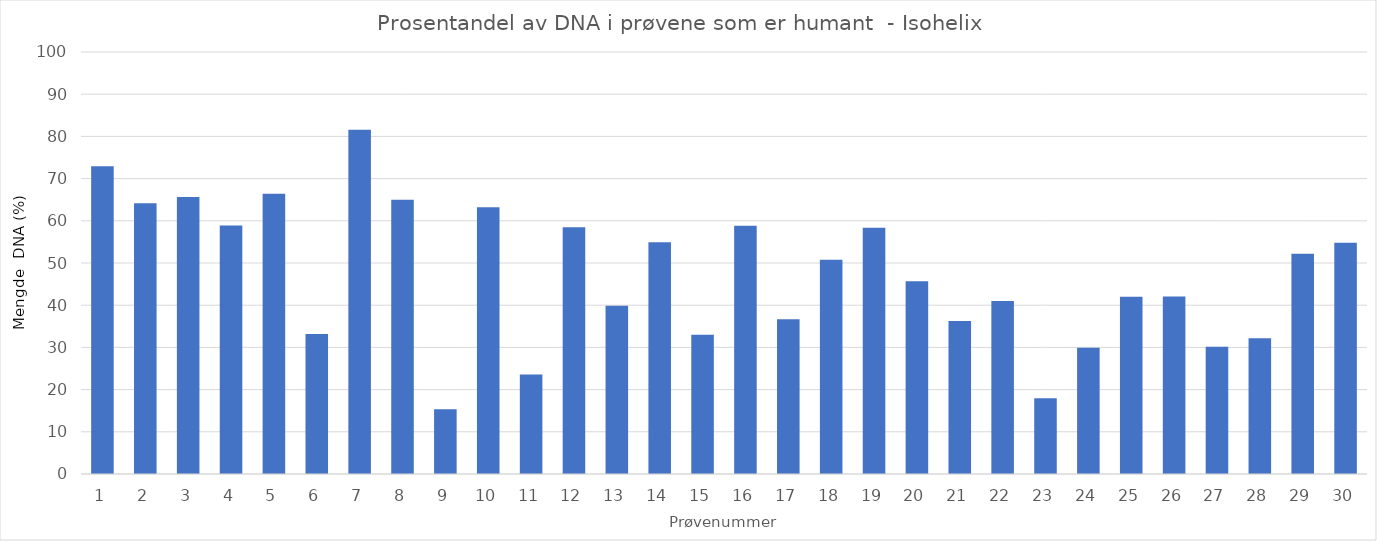
| Category | Humant DNA  |
|---|---|
| 0 | 72.906 |
| 1 | 64.176 |
| 2 | 65.618 |
| 3 | 58.895 |
| 4 | 66.389 |
| 5 | 33.152 |
| 6 | 81.591 |
| 7 | 64.998 |
| 8 | 15.361 |
| 9 | 63.233 |
| 10 | 23.552 |
| 11 | 58.456 |
| 12 | 39.899 |
| 13 | 54.927 |
| 14 | 32.983 |
| 15 | 58.807 |
| 16 | 36.653 |
| 17 | 50.741 |
| 18 | 58.342 |
| 19 | 45.698 |
| 20 | 36.28 |
| 21 | 41.009 |
| 22 | 17.933 |
| 23 | 29.946 |
| 24 | 42.008 |
| 25 | 42.048 |
| 26 | 30.139 |
| 27 | 32.193 |
| 28 | 52.198 |
| 29 | 54.773 |